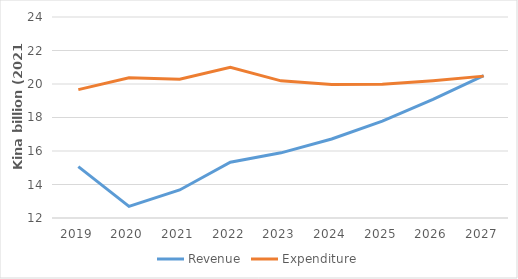
| Category | Revenue | Expenditure |
|---|---|---|
| 2019.0 | 15068.263 | 19663.475 |
| 2020.0 | 12697.965 | 20367.69 |
| 2021.0 | 13674.5 | 20287.3 |
| 2022.0 | 15331.629 | 20998.864 |
| 2023.0 | 15889.774 | 20188.963 |
| 2024.0 | 16717.128 | 19964.468 |
| 2025.0 | 17786.858 | 19991.409 |
| 2026.0 | 19078.981 | 20197.466 |
| 2027.0 | 20505.457 | 20469.864 |